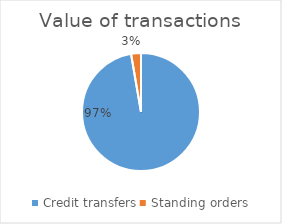
| Category | Value of transactions |
|---|---|
| Credit transfers | 2254514852280 |
| Standing orders | 62655838900 |